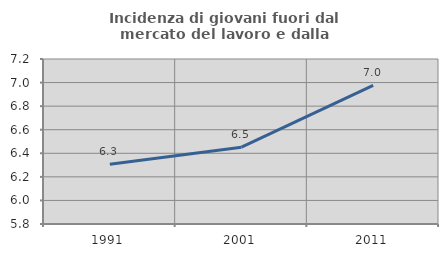
| Category | Incidenza di giovani fuori dal mercato del lavoro e dalla formazione  |
|---|---|
| 1991.0 | 6.306 |
| 2001.0 | 6.452 |
| 2011.0 | 6.977 |